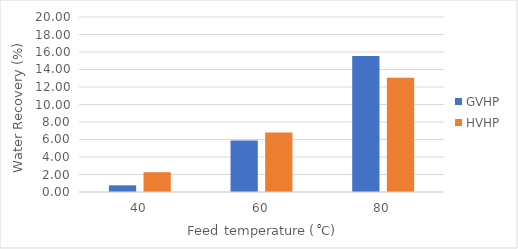
| Category | GVHP | HVHP |
|---|---|---|
| 40.0 | 0.763 | 2.26 |
| 60.0 | 5.88 | 6.79 |
| 80.0 | 15.55 | 13.063 |